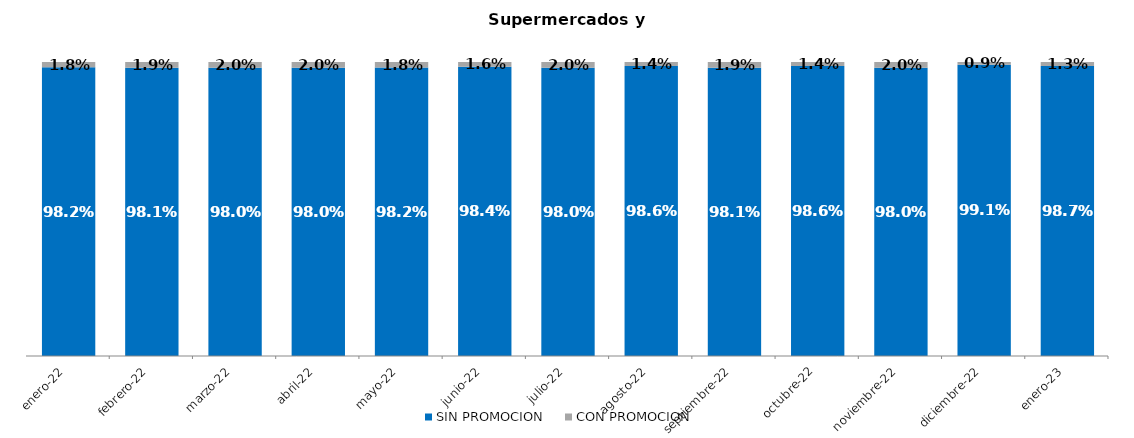
| Category | SIN PROMOCION   | CON PROMOCION   |
|---|---|---|
| 2022-01-01 | 0.982 | 0.018 |
| 2022-02-01 | 0.981 | 0.019 |
| 2022-03-01 | 0.98 | 0.02 |
| 2022-04-01 | 0.98 | 0.02 |
| 2022-05-01 | 0.982 | 0.018 |
| 2022-06-01 | 0.984 | 0.016 |
| 2022-07-01 | 0.98 | 0.02 |
| 2022-08-01 | 0.986 | 0.014 |
| 2022-09-01 | 0.981 | 0.019 |
| 2022-10-01 | 0.986 | 0.014 |
| 2022-11-01 | 0.98 | 0.02 |
| 2022-12-01 | 0.991 | 0.009 |
| 2023-01-01 | 0.987 | 0.013 |